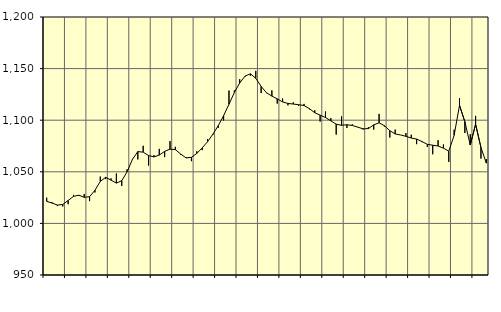
| Category | Piggar | Series 1 |
|---|---|---|
| nan | 1024.9 | 1021.36 |
| 1.0 | 1020.5 | 1019.7 |
| 1.0 | 1016.8 | 1017.78 |
| 1.0 | 1016.4 | 1018.34 |
| nan | 1018.6 | 1022.22 |
| 2.0 | 1027.6 | 1026.17 |
| 2.0 | 1026.6 | 1027.33 |
| 2.0 | 1028.5 | 1025.29 |
| nan | 1021.6 | 1025.85 |
| 3.0 | 1030 | 1032.08 |
| 3.0 | 1045.4 | 1040.68 |
| 3.0 | 1042.9 | 1044.65 |
| nan | 1043.6 | 1041.96 |
| 4.0 | 1048.3 | 1039.05 |
| 4.0 | 1036.3 | 1041.36 |
| 4.0 | 1052.4 | 1050.04 |
| nan | 1061.6 | 1062.05 |
| 5.0 | 1062 | 1069.59 |
| 5.0 | 1075.2 | 1069.02 |
| 5.0 | 1056.1 | 1065.77 |
| nan | 1066.2 | 1064.43 |
| 6.0 | 1072.2 | 1066.2 |
| 6.0 | 1064.2 | 1069.78 |
| 6.0 | 1079.7 | 1071.93 |
| nan | 1074.2 | 1071.51 |
| 7.0 | 1066.5 | 1067.18 |
| 7.0 | 1064.3 | 1063.44 |
| 7.0 | 1060.3 | 1064.03 |
| nan | 1069.9 | 1067.8 |
| 8.0 | 1071 | 1073.13 |
| 8.0 | 1081.8 | 1079.12 |
| 8.0 | 1085.7 | 1086.42 |
| nan | 1092.6 | 1094.68 |
| 9.0 | 1099.7 | 1104.4 |
| 9.0 | 1128.7 | 1115.47 |
| 9.0 | 1128.9 | 1126.77 |
| nan | 1139.7 | 1136.06 |
| 10.0 | 1142.2 | 1142.74 |
| 10.0 | 1143.1 | 1144.95 |
| 10.0 | 1147.8 | 1140.62 |
| nan | 1126.3 | 1132.73 |
| 11.0 | 1126.2 | 1126.57 |
| 11.0 | 1128.9 | 1123.35 |
| 11.0 | 1116.1 | 1120.68 |
| nan | 1121 | 1117.74 |
| 12.0 | 1114.4 | 1116.23 |
| 12.0 | 1117.3 | 1115.65 |
| 12.0 | 1113.9 | 1114.99 |
| nan | 1115.8 | 1114.23 |
| 13.0 | 1110.6 | 1111.19 |
| 13.0 | 1109.6 | 1107.23 |
| 13.0 | 1098.7 | 1104.9 |
| nan | 1108.5 | 1102.59 |
| 14.0 | 1102 | 1099.39 |
| 14.0 | 1086.1 | 1096.15 |
| 14.0 | 1103.7 | 1095.06 |
| nan | 1092.5 | 1095.6 |
| 15.0 | 1096 | 1094.88 |
| 15.0 | 1093.5 | 1093.29 |
| 15.0 | 1091 | 1091.65 |
| nan | 1093.2 | 1091.86 |
| 16.0 | 1090.9 | 1095.48 |
| 16.0 | 1106.1 | 1097.48 |
| 16.0 | 1093.9 | 1094.66 |
| nan | 1083.2 | 1089.84 |
| 17.0 | 1090.9 | 1086.66 |
| 17.0 | 1085.7 | 1085.69 |
| 17.0 | 1087.5 | 1084.38 |
| nan | 1085.9 | 1082.72 |
| 18.0 | 1076.8 | 1081.71 |
| 18.0 | 1078.8 | 1079.32 |
| 18.0 | 1074.1 | 1076.61 |
| nan | 1067 | 1075.77 |
| 19.0 | 1080.6 | 1074.99 |
| 19.0 | 1076.5 | 1072.93 |
| 19.0 | 1059.6 | 1070.01 |
| nan | 1090.8 | 1085.41 |
| 20.0 | 1121.3 | 1114.39 |
| 20.0 | 1087.6 | 1098.5 |
| 20.0 | 1086.4 | 1075.93 |
| nan | 1104.2 | 1096.05 |
| 21.0 | 1062.8 | 1073.49 |
| 21.0 | 1062.4 | 1058.4 |